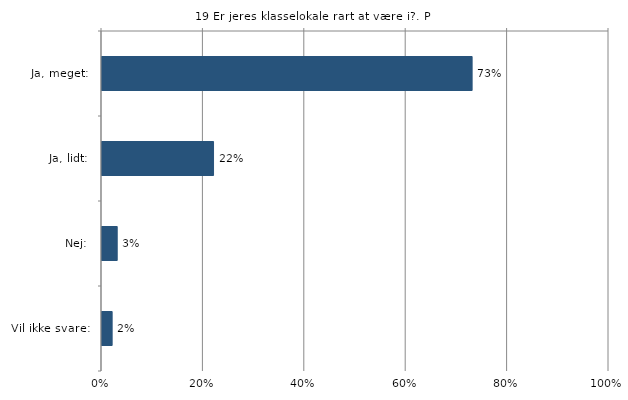
| Category | Er jeres klasselokale rart at være i? |
|---|---|
| Ja, meget:  | 0.73 |
| Ja, lidt:  | 0.22 |
| Nej:  | 0.03 |
| Vil ikke svare:  | 0.02 |